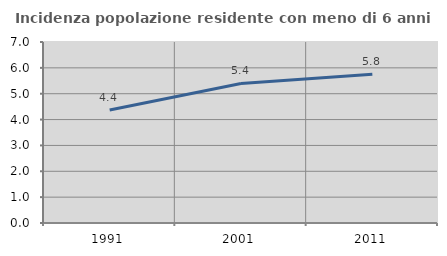
| Category | Incidenza popolazione residente con meno di 6 anni |
|---|---|
| 1991.0 | 4.367 |
| 2001.0 | 5.398 |
| 2011.0 | 5.753 |